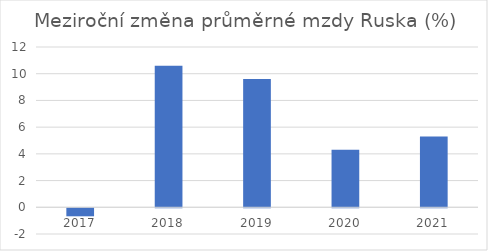
| Category | Meziroční změna průměrné mzdy Ruska (%) |
|---|---|
| 2017.0 | -0.6 |
| 2018.0 | 10.6 |
| 2019.0 | 9.6 |
| 2020.0 | 4.3 |
| 2021.0 | 5.3 |